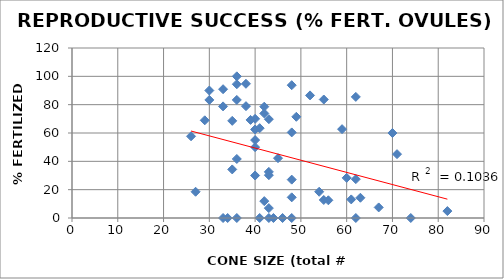
| Category | % FEC |
|---|---|
| 26.0 | 57.692 |
| 27.0 | 18.519 |
| 29.0 | 68.966 |
| 30.0 | 83.333 |
| 30.0 | 90 |
| 33.0 | 78.788 |
| 33.0 | 0 |
| 33.0 | 90.909 |
| 34.0 | 0 |
| 35.0 | 68.571 |
| 35.0 | 34.286 |
| 36.0 | 100 |
| 36.0 | 0 |
| 36.0 | 83.333 |
| 36.0 | 94.444 |
| 36.0 | 41.667 |
| 38.0 | 94.737 |
| 38.0 | 78.947 |
| 39.0 | 69.231 |
| 40.0 | 62.5 |
| 40.0 | 30 |
| 40.0 | 55 |
| 40.0 | 50 |
| 40.0 | 70 |
| 41.0 | 0 |
| 41.0 | 63.415 |
| 42.0 | 78.571 |
| 42.0 | 73.81 |
| 42.0 | 11.905 |
| 43.0 | 69.767 |
| 43.0 | 30.233 |
| 43.0 | 0 |
| 43.0 | 32.558 |
| 43.0 | 6.977 |
| 44.0 | 0 |
| 45.0 | 42.222 |
| 46.0 | 0 |
| 48.0 | 93.75 |
| 48.0 | 27.083 |
| 48.0 | 0 |
| 48.0 | 14.583 |
| 48.0 | 60.417 |
| 49.0 | 71.429 |
| 52.0 | 86.538 |
| 54.0 | 18.519 |
| 55.0 | 83.636 |
| 55.0 | 12.727 |
| 56.0 | 12.5 |
| 59.0 | 62.712 |
| 60.0 | 28.333 |
| 61.0 | 13.115 |
| 62.0 | 27.419 |
| 62.0 | 85.484 |
| 62.0 | 0 |
| 63.0 | 14.286 |
| 67.0 | 7.463 |
| 70.0 | 60 |
| 71.0 | 45.07 |
| 74.0 | 0 |
| 82.0 | 4.878 |